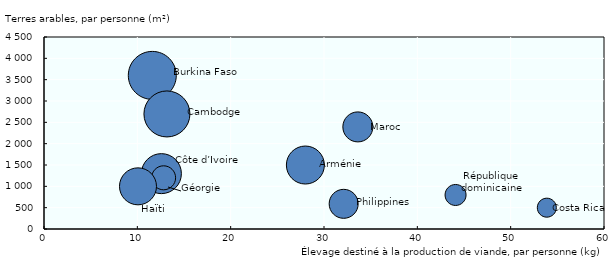
| Category | Series 0 |
|---|---|
| 28.002185110559946 | 1500 |
| 11.603522105405855 | 3600 |
| 12.567978988543873 | 1300 |
| 53.87200880157011 | 500 |
| 44.08394258840812 | 800 |
| 12.815148305084746 | 1200 |
| 10.069359862850556 | 1000 |
| 13.154435661114679 | 2700 |
| 33.59341608622997 | 2400 |
| 32.06174300008949 | 600 |